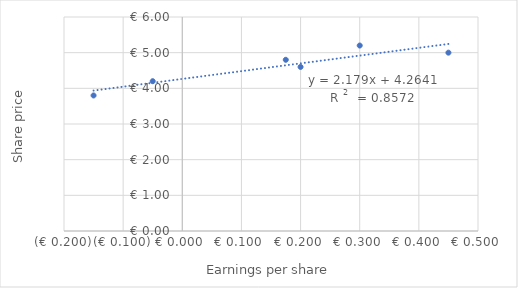
| Category | Series 0 |
|---|---|
| 0.45 | 5 |
| 0.2 | 4.6 |
| -0.15 | 3.8 |
| 0.175 | 4.8 |
| 0.3 | 5.2 |
| -0.05 | 4.2 |